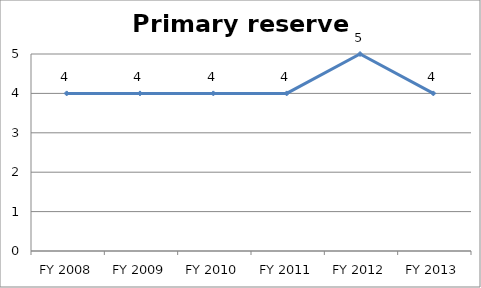
| Category | Primary reserve score |
|---|---|
| FY 2013 | 4 |
| FY 2012 | 5 |
| FY 2011 | 4 |
| FY 2010 | 4 |
| FY 2009 | 4 |
| FY 2008 | 4 |